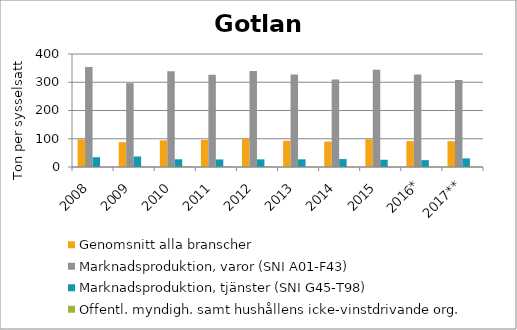
| Category | Genomsnitt alla branscher | Marknadsproduktion, varor (SNI A01-F43) | Marknadsproduktion, tjänster (SNI G45-T98) | Offentl. myndigh. samt hushållens icke-vinstdrivande org. |
|---|---|---|---|---|
| 2008 | 98.127 | 353.822 | 34.511 | 1.191 |
| 2009 | 87.78 | 296.865 | 37.285 | 1.462 |
| 2010 | 94.382 | 338.838 | 27.335 | 1.477 |
| 2011 | 96.124 | 326.452 | 26.702 | 1.413 |
| 2012 | 99.843 | 339.671 | 27.018 | 1.355 |
| 2013 | 92.911 | 327.692 | 27.111 | 1.216 |
| 2014 | 89.981 | 309.784 | 28.077 | 1.179 |
| 2015 | 98.321 | 343.999 | 25.637 | 1.313 |
| 2016* | 91.634 | 327.143 | 24.33 | 1.39 |
| 2017** | 91.253 | 308.222 | 30.511 | 1.272 |